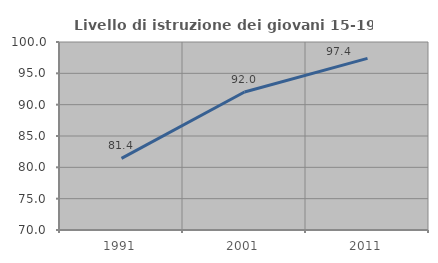
| Category | Livello di istruzione dei giovani 15-19 anni |
|---|---|
| 1991.0 | 81.433 |
| 2001.0 | 92.03 |
| 2011.0 | 97.382 |